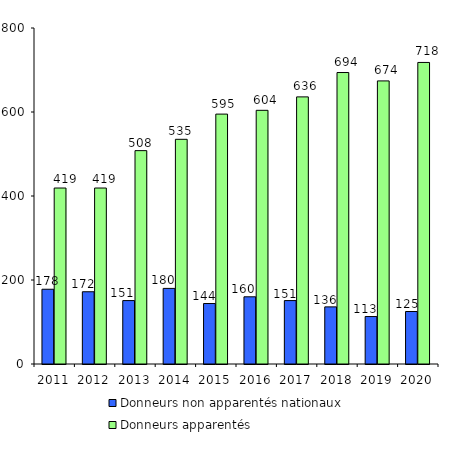
| Category | Donneurs non apparentés nationaux | Donneurs apparentés |
|---|---|---|
| 2011.0 | 178 | 419 |
| 2012.0 | 172 | 419 |
| 2013.0 | 151 | 508 |
| 2014.0 | 180 | 535 |
| 2015.0 | 144 | 595 |
| 2016.0 | 160 | 604 |
| 2017.0 | 151 | 636 |
| 2018.0 | 136 | 694 |
| 2019.0 | 113 | 674 |
| 2020.0 | 125 | 718 |